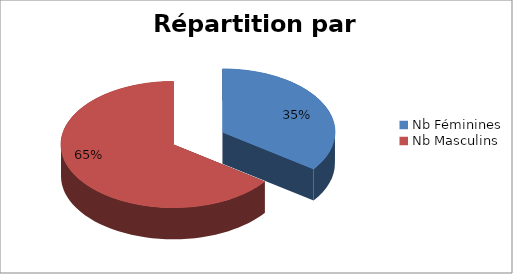
| Category | Series 0 |
|---|---|
| Nb Féminines | 72 |
| Nb Masculins | 134 |